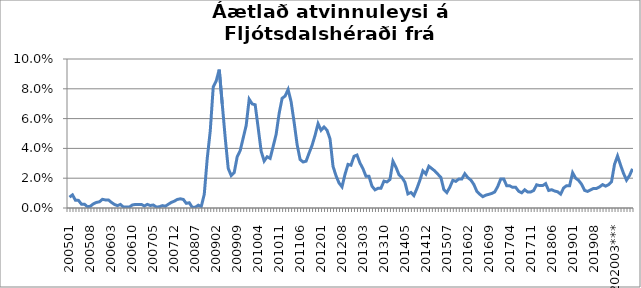
| Category | Series 0 |
|---|---|
| 200501 | 0.007 |
| 200502 | 0.009 |
| 200503 | 0.005 |
| 200504 | 0.005 |
| 200505 | 0.003 |
| 200506 | 0.003 |
| 200507 | 0.001 |
| 200508 | 0.001 |
| 200509 | 0.003 |
| 200510 | 0.004 |
| 200511 | 0.004 |
| 200512 | 0.006 |
| 200601 | 0.005 |
| 200602 | 0.005 |
| 200603 | 0.004 |
| 200604 | 0.002 |
| 200605 | 0.002 |
| 200606 | 0.002 |
| 200607 | 0.001 |
| 200608 | 0.001 |
| 200609 | 0.001 |
| 200610 | 0.002 |
| 200611 | 0.002 |
| 200612 | 0.002 |
| 200701 | 0.002 |
| 200702 | 0.001 |
| 200703 | 0.002 |
| 200704 | 0.002 |
| 200705 | 0.002 |
| 200706 | 0.001 |
| 200707 | 0.001 |
| 200708 | 0.002 |
| 200709 | 0.001 |
| 200710 | 0.003 |
| 200711 | 0.004 |
| 200712 | 0.005 |
| 200801 | 0.006 |
| 200802 | 0.006 |
| 200803 | 0.006 |
| 200804 | 0.003 |
| 200805 | 0.004 |
| 200806 | 0 |
| 200807 | 0 |
| 200808 | 0.002 |
| 200809 | 0.001 |
| 200810 | 0.009 |
| 200811 | 0.033 |
| 200812 | 0.052 |
| 200901 | 0.081 |
| 200902 | 0.085 |
| 200903 | 0.093 |
| 200904 | 0.07 |
| 200905 | 0.047 |
| 200906 | 0.027 |
| 200907 | 0.022 |
| 200908 | 0.024 |
| 200909 | 0.034 |
| 200910 | 0.039 |
| 200911 | 0.047 |
| 200912 | 0.055 |
| 201001 | 0.073 |
| 201002 | 0.07 |
| 201003 | 0.069 |
| 201004 | 0.054 |
| 201005 | 0.038 |
| 201006 | 0.032 |
| 201007 | 0.034 |
| 201008 | 0.033 |
| 201009 | 0.041 |
| 201010 | 0.049 |
| 201011 | 0.063 |
| 201012 | 0.074 |
| 201101 | 0.075 |
| 201102 | 0.08 |
| 201103 | 0.071 |
| 201104 | 0.058 |
| 201105 | 0.043 |
| 201106 | 0.033 |
| 201107 | 0.031 |
| 201108 | 0.031 |
| 201109 | 0.037 |
| 201110 | 0.042 |
| 201111 | 0.049 |
| 201112 | 0.057 |
| 201201 | 0.052 |
| 201202 | 0.054 |
| 201203 | 0.052 |
| 201204 | 0.046 |
| 201205 | 0.028 |
| 201206 | 0.022 |
| 201207 | 0.017 |
| 201208 | 0.014 |
| 201209 | 0.023 |
| 201210 | 0.029 |
| 201211 | 0.029 |
| 201212 | 0.035 |
| 201301 | 0.036 |
| 201302 | 0.03 |
| 201303 | 0.026 |
| 201304 | 0.021 |
| 201305 | 0.021 |
| 201306 | 0.015 |
| 201307 | 0.012 |
| 201308 | 0.013 |
| 201309 | 0.013 |
| 201310 | 0.018 |
| 201311 | 0.018 |
| 201312 | 0.019 |
| 201401 | 0.031 |
| 201402 | 0.027 |
| 201403 | 0.022 |
| 201404 | 0.02 |
| 201405 | 0.017 |
| 201406 | 0.009 |
| 201407 | 0.01 |
| 201408 | 0.008 |
| 201409 | 0.013 |
| 201410 | 0.019 |
| 201411 | 0.025 |
| 201412 | 0.023 |
| 201501 | 0.028 |
| 201502 | 0.026 |
| 201503 | 0.025 |
| 201504 | 0.023 |
| 201505 | 0.021 |
| 201506 | 0.012 |
| 201507 | 0.01 |
| 201508 | 0.014 |
| 201509 | 0.019 |
| 201510 | 0.018 |
| 201511 | 0.019 |
| 201512 | 0.019 |
| 201601 | 0.023 |
| 201602 | 0.02 |
| 201603 | 0.019 |
| 201604 | 0.016 |
| 201605 | 0.011 |
| 201606 | 0.009 |
| 201607 | 0.008 |
| 201608 | 0.009 |
| 201609 | 0.009 |
| 201610 | 0.01 |
| 201611 | 0.011 |
| 201612 | 0.014 |
| 201701 | 0.02 |
| 201702 | 0.02 |
| 201703 | 0.015 |
| 201704 | 0.015 |
| 201705 | 0.014 |
| 201706 | 0.014 |
| 201707 | 0.011 |
| 201708 | 0.01 |
| 201709 | 0.012 |
| 201710 | 0.011 |
| 201711 | 0.011 |
| 201712 | 0.012 |
| 201801 | 0.016 |
| 201802 | 0.015 |
| 201803 | 0.015 |
| 201804 | 0.016 |
| 201805 | 0.012 |
| 201806 | 0.012 |
| 201807 | 0.011 |
| 201808 | 0.011 |
| 201809 | 0.009 |
| 201810 | 0.013 |
| 201811 | 0.015 |
| 201812 | 0.015 |
| 201901 | 0.024 |
| 201902 | 0.02 |
| 201903 | 0.019 |
| 201904 | 0.016 |
| 201905 | 0.012 |
| 201906 | 0.011 |
| 201907 | 0.012 |
| 201908 | 0.013 |
| 201909 | 0.013 |
| 201910 | 0.014 |
| 201911 | 0.016 |
| 201912 | 0.015 |
| 202001 | 0.016 |
| 202002 | 0.018 |
| 202003*** | 0.029 |
| 202004 | 0.035 |
| 202005 | 0.029 |
| 202006 | 0.023 |
| 202007 | 0.019 |
| 202008 | 0.022 |
| 202009 | 0.026 |